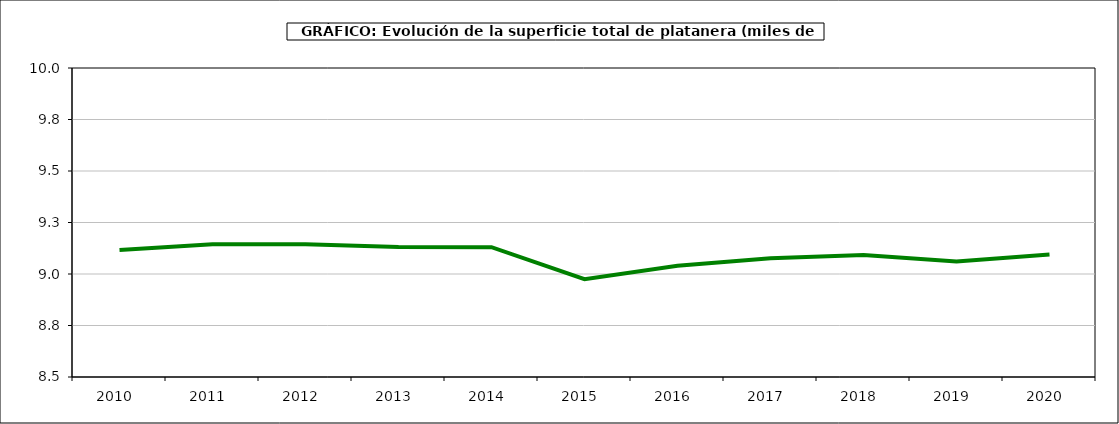
| Category | superficie platanera |
|---|---|
| 2010.0 | 9.117 |
| 2011.0 | 9.144 |
| 2012.0 | 9.144 |
| 2013.0 | 9.131 |
| 2014.0 | 9.13 |
| 2015.0 | 8.975 |
| 2016.0 | 9.04 |
| 2017.0 | 9.076 |
| 2018.0 | 9.092 |
| 2019.0 | 9.061 |
| 2020.0 | 9.095 |